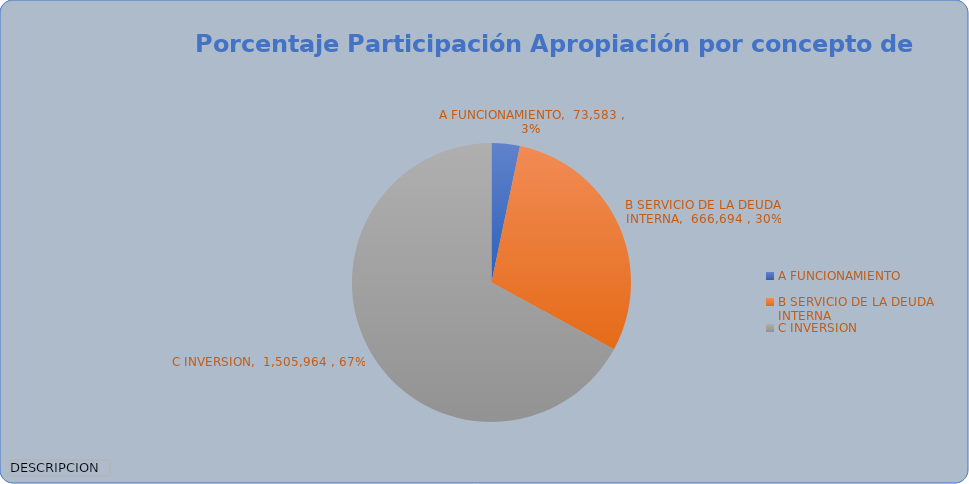
| Category | Total |
|---|---|
| A FUNCIONAMIENTO | 73583.024 |
| B SERVICIO DE LA DEUDA INTERNA | 666693.529 |
| C INVERSION | 1505964.092 |